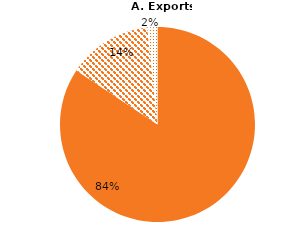
| Category | A. Exports (percentage of total exports) |
|---|---|
| Unprocessed | 84.354 |
| Semi-processed | 13.969 |
| Fully-processed | 1.676 |